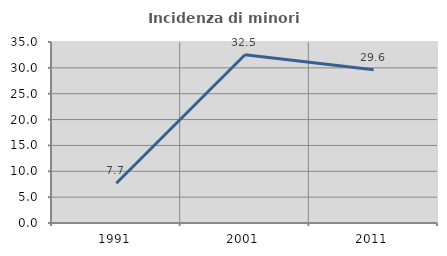
| Category | Incidenza di minori stranieri |
|---|---|
| 1991.0 | 7.692 |
| 2001.0 | 32.53 |
| 2011.0 | 29.63 |